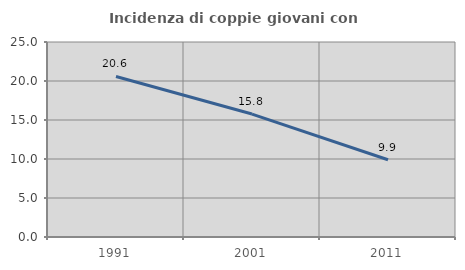
| Category | Incidenza di coppie giovani con figli |
|---|---|
| 1991.0 | 20.581 |
| 2001.0 | 15.761 |
| 2011.0 | 9.909 |